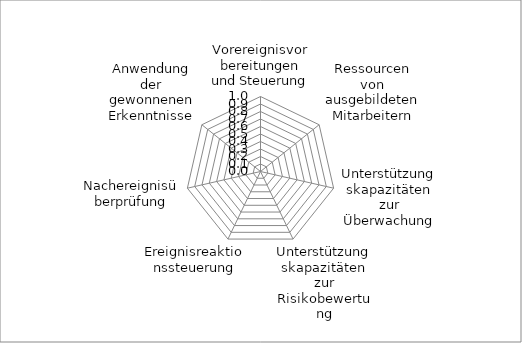
| Category | Series 0 |
|---|---|
| Vorereignisvorbereitungen und Steuerung | 0 |
| Ressourcen von ausgebildeten Mitarbeitern | 0 |
| Unterstützungskapazitäten zur Überwachung | 0 |
| Unterstützungskapazitäten zur Risikobewertung | 0 |
| Ereignisreaktionssteuerung | 0 |
| Nachereignisüberprüfung | 0 |
| Anwendung der gewonnenen Erkenntnisse | 0 |